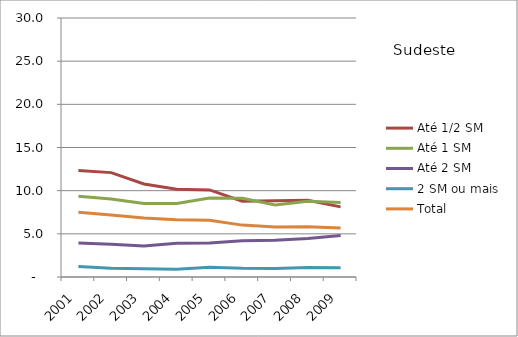
| Category | Até 1/2 SM | Até 1 SM | Até 2 SM | 2 SM ou mais | Total |
|---|---|---|---|---|---|
| 2001.0 | 12.33 | 9.35 | 3.94 | 1.22 | 7.51 |
| 2002.0 | 12.09 | 9.03 | 3.8 | 1.01 | 7.18 |
| 2003.0 | 10.78 | 8.52 | 3.58 | 0.96 | 6.83 |
| 2004.0 | 10.17 | 8.52 | 3.92 | 0.89 | 6.62 |
| 2005.0 | 10.09 | 9.14 | 3.95 | 1.12 | 6.58 |
| 2006.0 | 8.77 | 9.13 | 4.2 | 1 | 6.01 |
| 2007.0 | 8.82 | 8.35 | 4.27 | 0.99 | 5.78 |
| 2008.0 | 8.89 | 8.77 | 4.46 | 1.1 | 5.81 |
| 2009.0 | 8.12 | 8.63 | 4.8 | 1.08 | 5.68 |